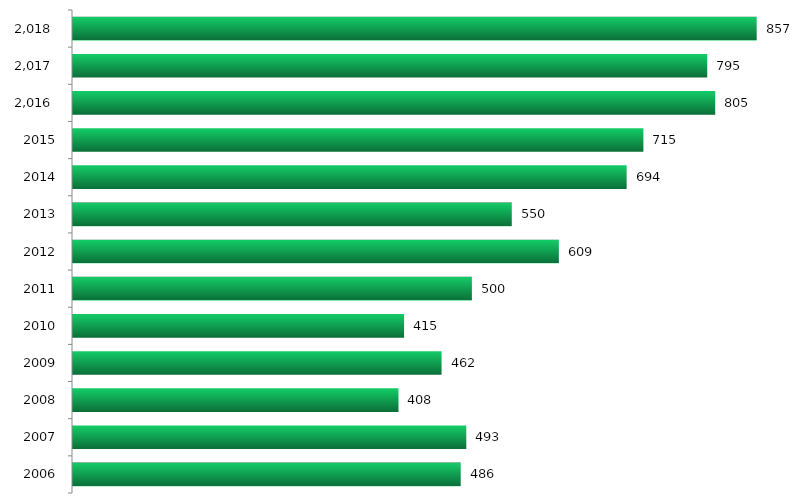
| Category | Concluintes |
|---|---|
| 2006.0 | 486 |
| 2007.0 | 493 |
| 2008.0 | 408 |
| 2009.0 | 462 |
| 2010.0 | 415 |
| 2011.0 | 500 |
| 2012.0 | 609 |
| 2013.0 | 550 |
| 2014.0 | 694 |
| 2015.0 | 715 |
| 2016.0 | 805 |
| 2017.0 | 795 |
| 2018.0 | 857 |